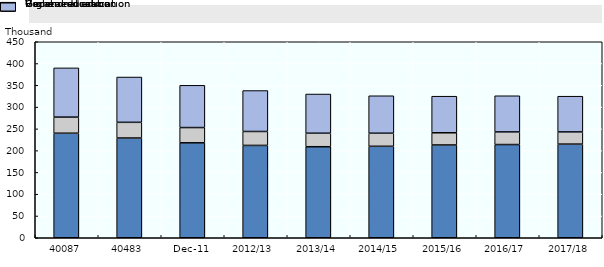
| Category | General education | Vocational education | Higher education |
|---|---|---|---|
| 40087 | 240 | 37 | 113 |
| 40483 | 229 | 36 | 104 |
| Dec-11 | 218 | 35 | 97 |
| 2012/13 | 212 | 32 | 94 |
| 2013/14 | 209 | 31 | 90 |
| 2014/15 | 210 | 30 | 86 |
| 2015/16 | 213 | 28 | 84 |
| 2016/17 | 214 | 29 | 83 |
| 2017/18 | 215 | 28 | 82 |